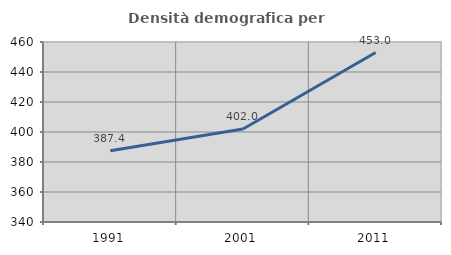
| Category | Densità demografica |
|---|---|
| 1991.0 | 387.431 |
| 2001.0 | 401.978 |
| 2011.0 | 452.991 |